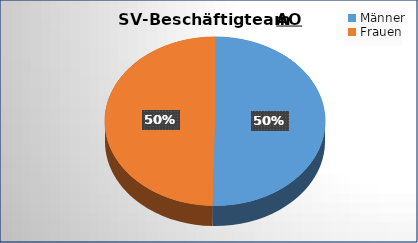
| Category | Series 0 |
|---|---|
| 0 | 31284 |
| 1 | 30857 |